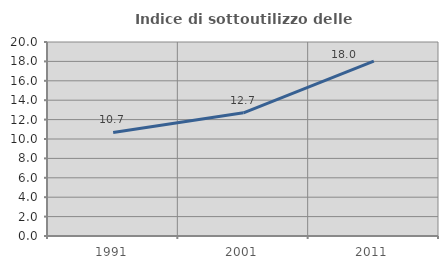
| Category | Indice di sottoutilizzo delle abitazioni  |
|---|---|
| 1991.0 | 10.676 |
| 2001.0 | 12.701 |
| 2011.0 | 18.028 |